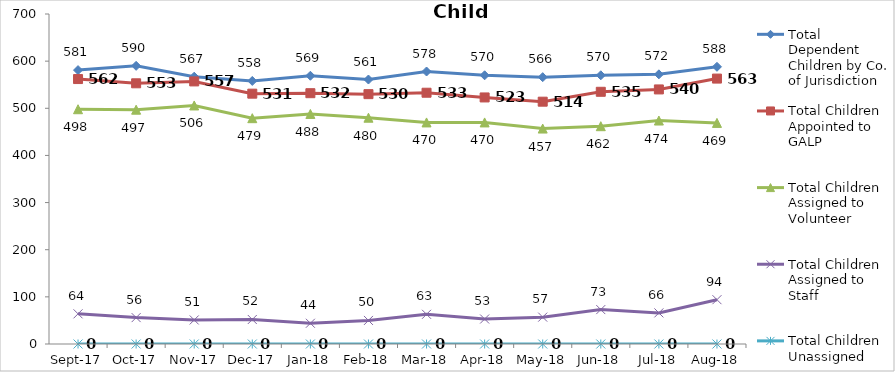
| Category | Total Dependent Children by Co. of Jurisdiction | Total Children Appointed to GALP | Total Children Assigned to Volunteer | Total Children Assigned to Staff | Total Children Unassigned |
|---|---|---|---|---|---|
| 2017-09-01 | 581 | 562 | 498 | 64 | 0 |
| 2017-10-01 | 590 | 553 | 497 | 56 | 0 |
| 2017-11-01 | 567 | 557 | 506 | 51 | 0 |
| 2017-12-01 | 558 | 531 | 479 | 52 | 0 |
| 2018-01-01 | 569 | 532 | 488 | 44 | 0 |
| 2018-02-01 | 561 | 530 | 480 | 50 | 0 |
| 2018-03-01 | 578 | 533 | 470 | 63 | 0 |
| 2018-04-01 | 570 | 523 | 470 | 53 | 0 |
| 2018-05-01 | 566 | 514 | 457 | 57 | 0 |
| 2018-06-01 | 570 | 535 | 462 | 73 | 0 |
| 2018-07-01 | 572 | 540 | 474 | 66 | 0 |
| 2018-08-01 | 588 | 563 | 469 | 94 | 0 |